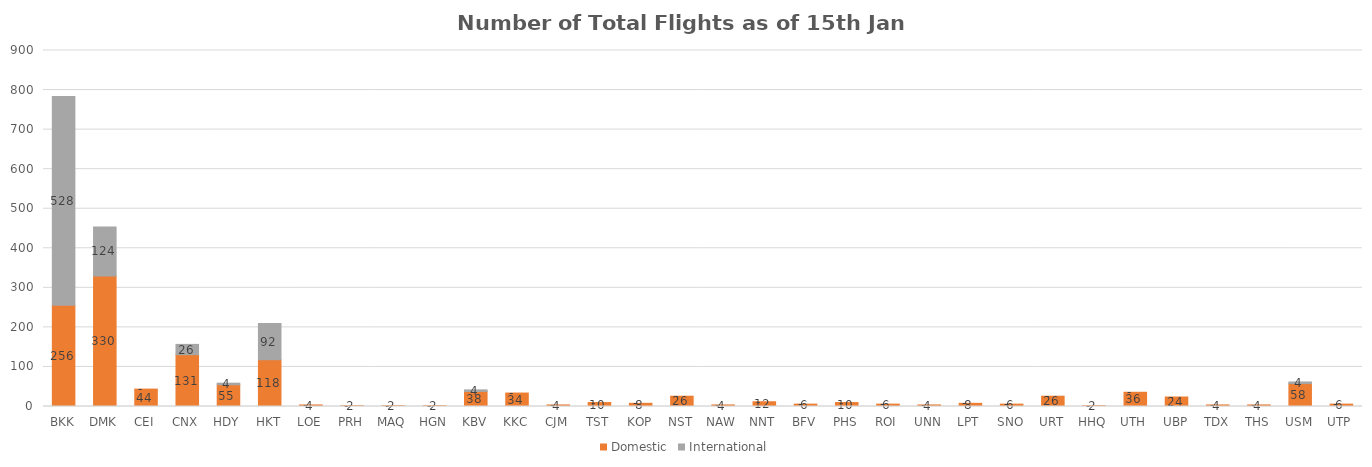
| Category | Domestic | International |
|---|---|---|
| BKK | 256 | 528 |
| DMK | 330 | 124 |
| CEI | 44 | 0 |
| CNX | 131 | 26 |
| HDY | 55 | 4 |
| HKT | 118 | 92 |
| LOE | 4 | 0 |
| PRH | 2 | 0 |
| MAQ | 2 | 0 |
| HGN | 2 | 0 |
| KBV | 38 | 4 |
| KKC | 34 | 0 |
| CJM | 4 | 0 |
| TST | 10 | 0 |
| KOP | 8 | 0 |
| NST | 26 | 0 |
| NAW | 4 | 0 |
| NNT | 12 | 0 |
| BFV | 6 | 0 |
| PHS | 10 | 0 |
| ROI | 6 | 0 |
| UNN | 4 | 0 |
| LPT | 8 | 0 |
| SNO | 6 | 0 |
| URT | 26 | 0 |
| HHQ | 2 | 0 |
| UTH | 36 | 0 |
| UBP | 24 | 0 |
| TDX | 4 | 0 |
| THS | 4 | 0 |
| USM | 58 | 4 |
| UTP | 6 | 0 |